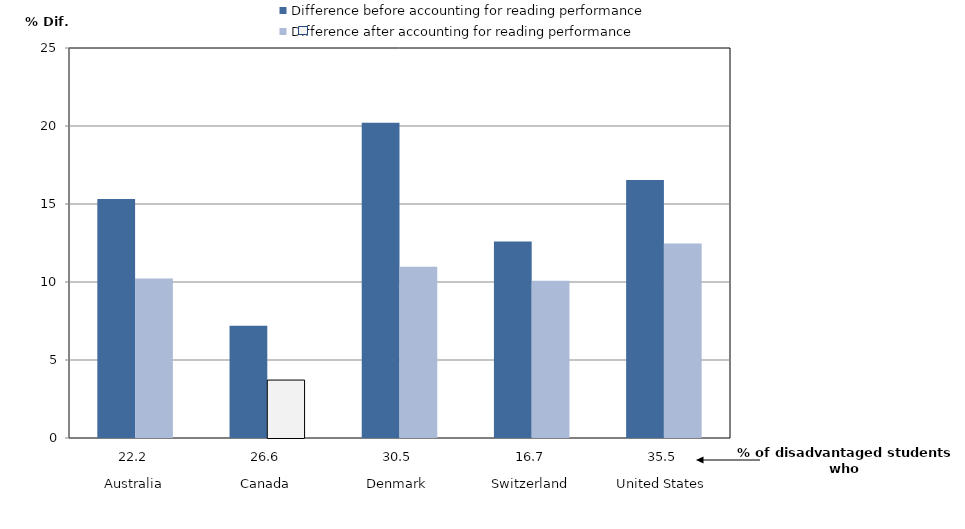
| Category | Difference before accounting for reading performance  | Difference after accounting for reading performance  |
|---|---|---|
| 0 | 15.32 | 10.226 |
| 1 | 7.193 | 3.713 |
| 2 | 20.204 | 10.982 |
| 3 | 12.594 | 10.078 |
| 4 | 16.542 | 12.474 |